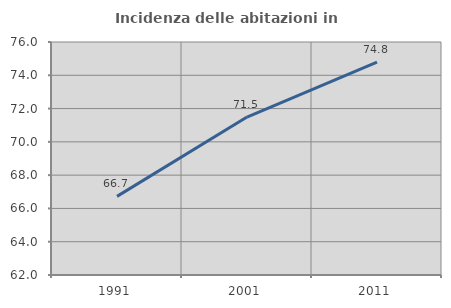
| Category | Incidenza delle abitazioni in proprietà  |
|---|---|
| 1991.0 | 66.724 |
| 2001.0 | 71.49 |
| 2011.0 | 74.791 |